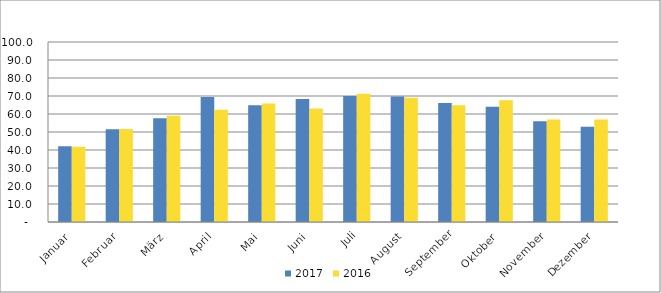
| Category | 2017 | 2016 |
|---|---|---|
| Januar | 42.096 | 41.837 |
| Februar | 51.56 | 51.658 |
| März | 57.576 | 59.023 |
| April | 69.46 | 62.313 |
| Mai | 64.83 | 65.782 |
| Juni | 68.267 | 63.046 |
| Juli | 69.937 | 71.247 |
| August | 69.751 | 69.034 |
| September | 66.174 | 64.835 |
| Oktober | 64.044 | 67.698 |
| November | 55.943 | 56.918 |
| Dezember | 52.929 | 56.936 |